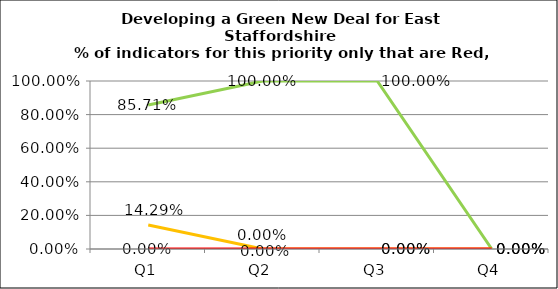
| Category | Green | Amber | Red |
|---|---|---|---|
| Q1 | 0.857 | 0.143 | 0 |
| Q2 | 1 | 0 | 0 |
| Q3 | 1 | 0 | 0 |
| Q4 | 0 | 0 | 0 |